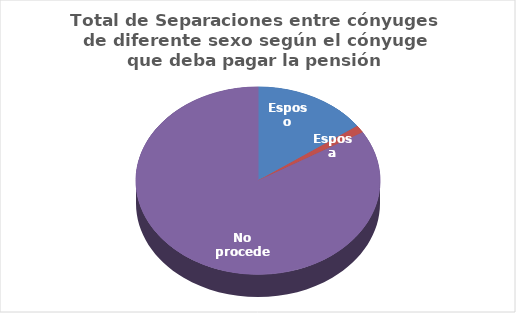
| Category | Series 0 |
|---|---|
| Esposo | 472 |
| Esposa | 41 |
| No procede | 2619 |